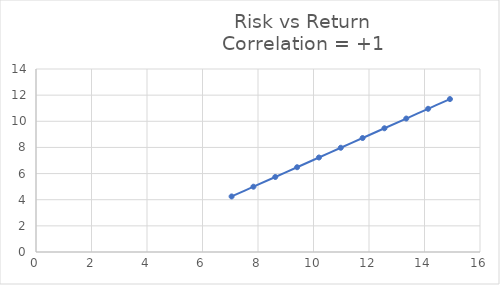
| Category | Return |
|---|---|
| 7.048936089935842 | 4.25 |
| 7.835719389659424 | 4.995 |
| 8.622502689383005 | 5.74 |
| 9.409285989106587 | 6.485 |
| 10.19606928883017 | 7.23 |
| 10.982852588553751 | 7.975 |
| 11.769635888277332 | 8.72 |
| 12.556419188000913 | 9.465 |
| 13.343202487724495 | 10.21 |
| 14.129985787448076 | 10.955 |
| 14.916769087171657 | 11.7 |